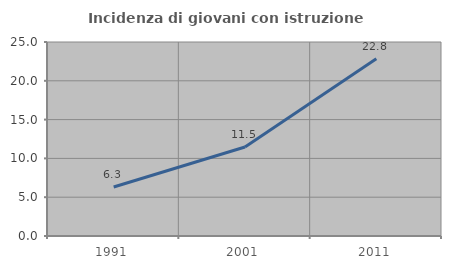
| Category | Incidenza di giovani con istruzione universitaria |
|---|---|
| 1991.0 | 6.316 |
| 2001.0 | 11.475 |
| 2011.0 | 22.826 |